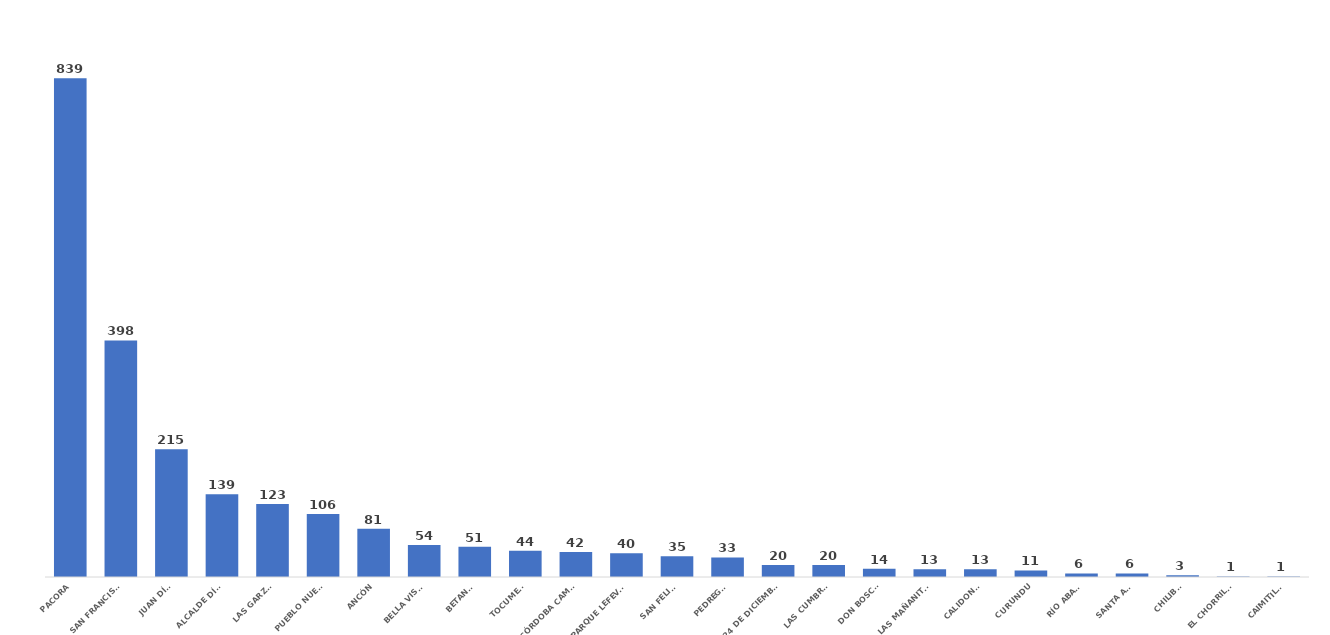
| Category | Total |
|---|---|
| PACORA | 839 |
| SAN FRANCISCO | 398 |
| JUAN DÍAZ | 215 |
| ALCALDE DÍAZ | 139 |
| LAS GARZAS | 123 |
| PUEBLO NUEVO | 106 |
| ANCÓN | 81 |
| BELLA VISTA | 54 |
| BETANIA | 51 |
| TOCUMEN | 44 |
| ERNESTO CÓRDOBA CAMPOS | 42 |
| PARQUE LEFEVRE | 40 |
| SAN FELIPE | 35 |
| PEDREGAL | 33 |
| 24 DE DICIEMBRE | 20 |
| LAS CUMBRES | 20 |
| DON BOSCO | 14 |
| LAS MAÑANITAS | 13 |
| CALIDONIA | 13 |
| CURUNDU | 11 |
| RÍO ABAJO | 6 |
| SANTA ANA | 6 |
| CHILIBRE | 3 |
| EL CHORRILLO | 1 |
| CAIMITILLO | 1 |